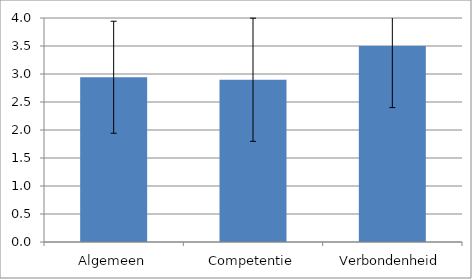
| Category | Meting na interventie |
|---|---|
| Algemeen | 2.942 |
| Competentie | 2.897 |
| Verbondenheid | 3.5 |